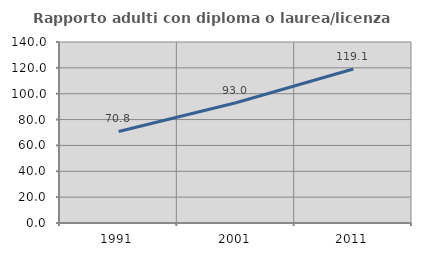
| Category | Rapporto adulti con diploma o laurea/licenza media  |
|---|---|
| 1991.0 | 70.783 |
| 2001.0 | 93.031 |
| 2011.0 | 119.127 |